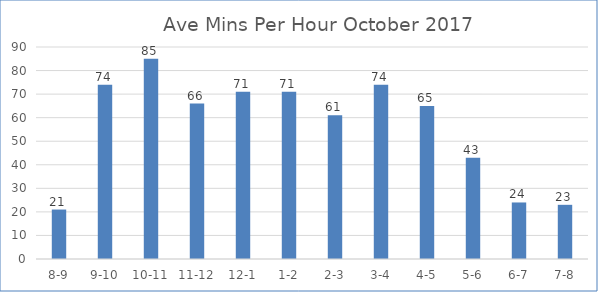
| Category | Ave Mins Per Hour  |
|---|---|
| 8-9 | 21 |
| 9-10 | 74 |
| 10-11 | 85 |
| 11-12 | 66 |
| 12-1 | 71 |
| 1-2 | 71 |
| 2-3 | 61 |
| 3-4 | 74 |
| 4-5 | 65 |
| 5-6 | 43 |
| 6-7 | 24 |
| 7-8 | 23 |